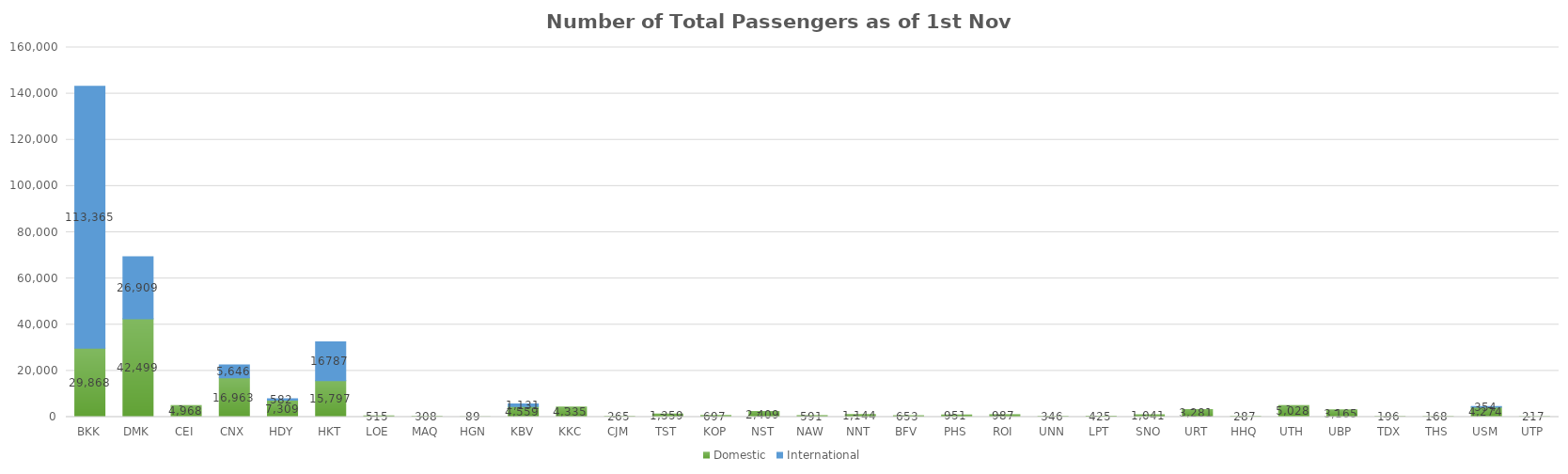
| Category | Domestic | International |
|---|---|---|
| BKK | 29868 | 113365 |
| DMK | 42499 | 26909 |
| CEI | 4968 | 0 |
| CNX | 16963 | 5646 |
| HDY | 7309 | 582 |
| HKT | 15797 | 16787 |
| LOE | 515 | 0 |
| MAQ | 308 | 0 |
| HGN | 89 | 0 |
| KBV | 4559 | 1131 |
| KKC | 4335 | 0 |
| CJM | 265 | 0 |
| TST | 1359 | 0 |
| KOP | 697 | 0 |
| NST | 2409 | 0 |
| NAW | 591 | 0 |
| NNT | 1144 | 0 |
| BFV | 653 | 0 |
| PHS | 951 | 0 |
| ROI | 987 | 0 |
| UNN | 346 | 0 |
| LPT | 425 | 0 |
| SNO | 1041 | 0 |
| URT | 3281 | 0 |
| HHQ | 287 | 0 |
| UTH | 5028 | 0 |
| UBP | 3165 | 0 |
| TDX | 196 | 0 |
| THS | 168 | 0 |
| USM | 4274 | 354 |
| UTP | 217 | 0 |